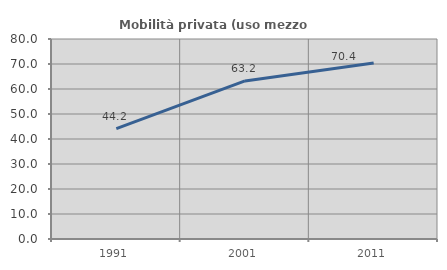
| Category | Mobilità privata (uso mezzo privato) |
|---|---|
| 1991.0 | 44.152 |
| 2001.0 | 63.235 |
| 2011.0 | 70.4 |